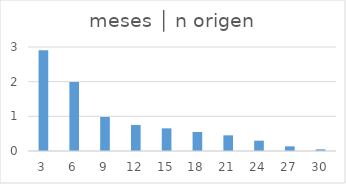
| Category | meses │ n origen |
|---|---|
| 3.0 | 2.904 |
| 6.0 | 1.99 |
| 9.0 | 0.981 |
| 12.0 | 0.75 |
| 15.0 | 0.654 |
| 18.0 | 0.548 |
| 21.0 | 0.452 |
| 24.0 | 0.298 |
| 27.0 | 0.135 |
| 30.0 | 0.048 |